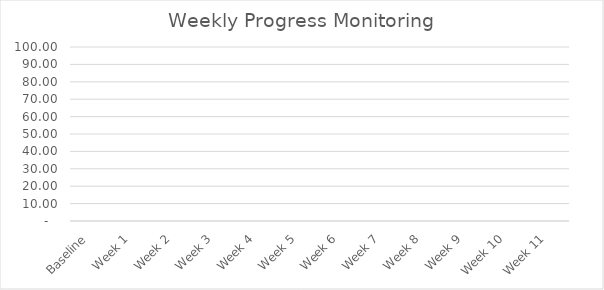
| Category | Series 0 |
|---|---|
| Baseline | 0 |
| Week 1 | 0 |
| Week 2 | 0 |
| Week 3 | 0 |
| Week 4 | 0 |
| Week 5 | 0 |
| Week 6 | 0 |
| Week 7 | 0 |
| Week 8 | 0 |
| Week 9 | 0 |
| Week 10 | 0 |
| Week 11 | 0 |